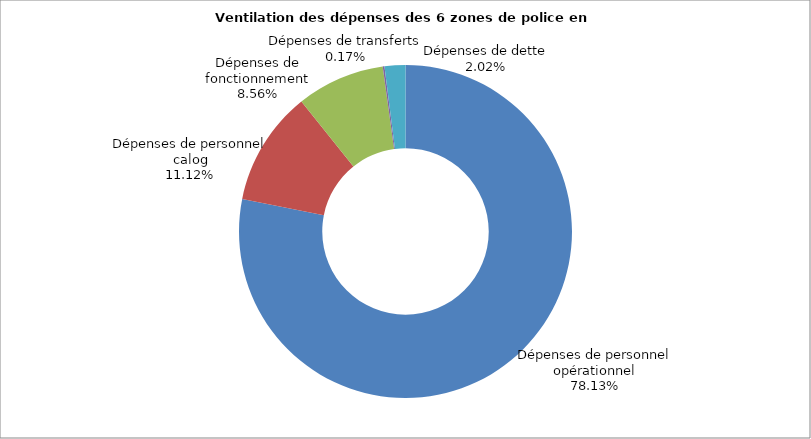
| Category | Series 0 |
|---|---|
| Dépenses de personnel opérationnel | 0.781 |
| Dépenses de personnel calog | 0.111 |
| Dépenses de fonctionnement | 0.086 |
| Dépenses de transferts | 0.002 |
| Dépenses de dette | 0.02 |